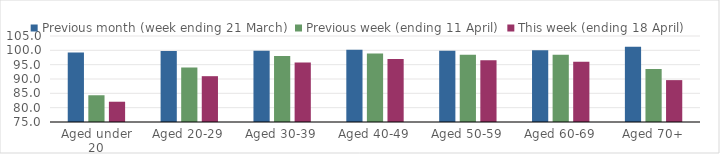
| Category | Previous month (week ending 21 March) | Previous week (ending 11 April) | This week (ending 18 April) |
|---|---|---|---|
| Aged under 20 | 99.238 | 84.331 | 82.073 |
| Aged 20-29 | 99.804 | 94.045 | 90.983 |
| Aged 30-39 | 99.842 | 98.003 | 95.726 |
| Aged 40-49 | 100.204 | 98.914 | 96.942 |
| Aged 50-59 | 99.868 | 98.481 | 96.546 |
| Aged 60-69 | 100.028 | 98.494 | 95.987 |
| Aged 70+ | 101.293 | 93.473 | 89.608 |